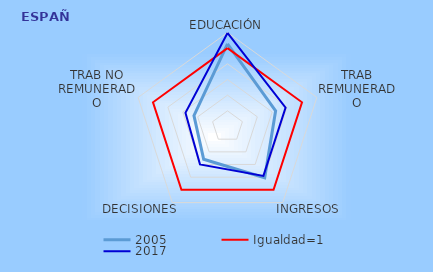
| Category | 2005 | Igualdad=1 | 2017 |
|---|---|---|---|
| EDUCACIÓN | 1.055 | 1 | 1.194 |
| TRAB REMUNERADO | 0.646 | 1 | 0.78 |
| INGRESOS | 0.808 | 1 | 0.78 |
| DECISIONES | 0.518 | 1 | 0.597 |
| TRAB NO REMUNERADO | 0.45 | 1 | 0.564 |